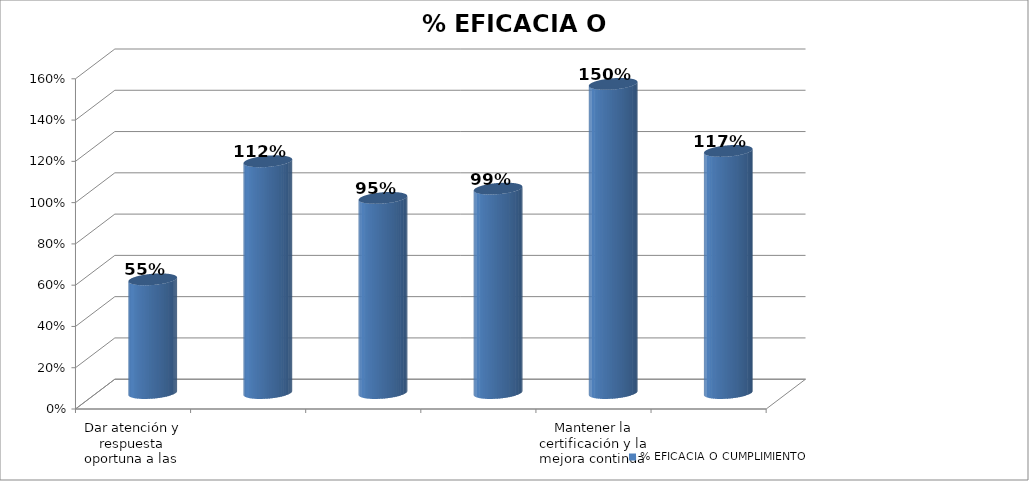
| Category | % EFICACIA O CUMPLIMIENTO |
|---|---|
| Dar atención y respuesta oportuna a las quejas, reclamos y consultas, formuladas por la ciudadania. | 0.551 |
| Formular, desarrollar y ejecutar, oportunamente, los proyectos de inversión de la entidad. | 1.123 |
| Supervisar las organizaciones de la economía solidaria, que estan bajo su competencia. | 0.945 |
| Mejorar los canales internos y externos de comunicación de la entidad. | 0.99 |
| Mantener la certificación y la mejora continua del Sistema de Gestión de la Calidad de la entidad bajo los requisitos de las normas ISO 9001 y NTCGP 1000.  | 1.498 |
| Mejorar la calidad del servicio fortaleciendo el Talento Humano. | 1.173 |